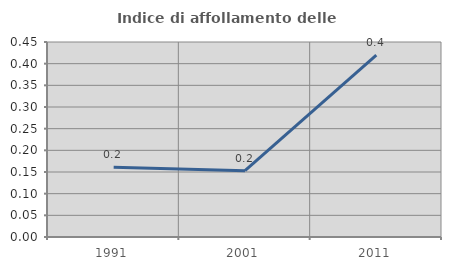
| Category | Indice di affollamento delle abitazioni  |
|---|---|
| 1991.0 | 0.161 |
| 2001.0 | 0.153 |
| 2011.0 | 0.42 |